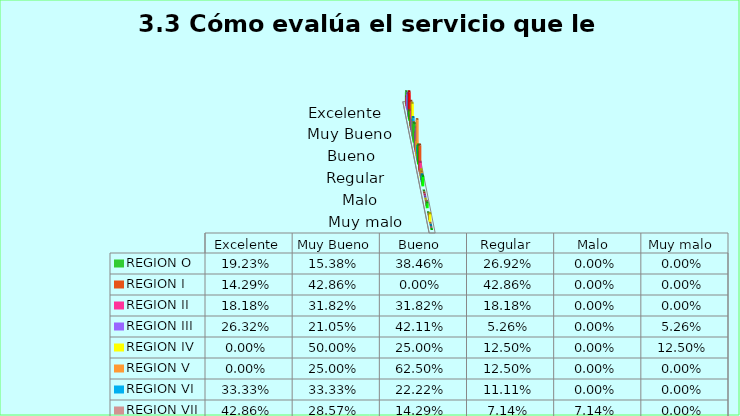
| Category | REGION O | REGION I  | REGION II | REGION III | REGION IV | REGION V  | REGION VI  | REGION VII  | REGION VIII |
|---|---|---|---|---|---|---|---|---|---|
| Excelente | 0.192 | 0.143 | 0.182 | 0.263 | 0 | 0 | 0.333 | 0.429 | 0.154 |
| Muy Bueno | 0.154 | 0.429 | 0.318 | 0.211 | 0.5 | 0.25 | 0.333 | 0.286 | 0.308 |
| Bueno  | 0.385 | 0 | 0.318 | 0.421 | 0.25 | 0.625 | 0.222 | 0.143 | 0.308 |
| Regular  | 0.269 | 0.429 | 0.182 | 0.053 | 0.125 | 0.125 | 0.111 | 0.071 | 0.154 |
| Malo  | 0 | 0 | 0 | 0 | 0 | 0 | 0 | 0.071 | 0.077 |
| Muy malo  | 0 | 0 | 0 | 0.053 | 0.125 | 0 | 0 | 0 | 0 |